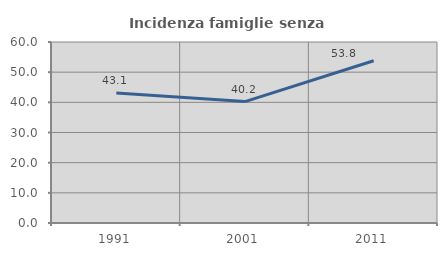
| Category | Incidenza famiglie senza nuclei |
|---|---|
| 1991.0 | 43.085 |
| 2001.0 | 40.244 |
| 2011.0 | 53.801 |